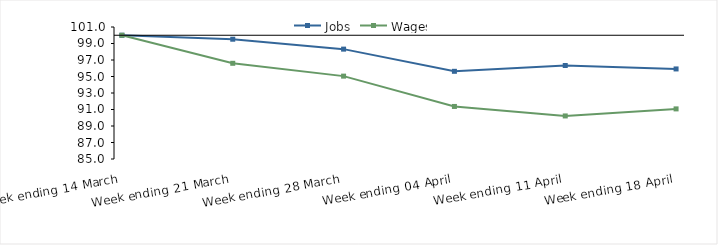
| Category | Jobs | Wages |
|---|---|---|
| 0 | 100 | 100 |
| 1900-01-01 | 99.519 | 96.6 |
| 1900-01-02 | 98.317 | 95.045 |
| 1900-01-03 | 95.629 | 91.369 |
| 1900-01-04 | 96.333 | 90.22 |
| 1900-01-05 | 95.917 | 91.073 |